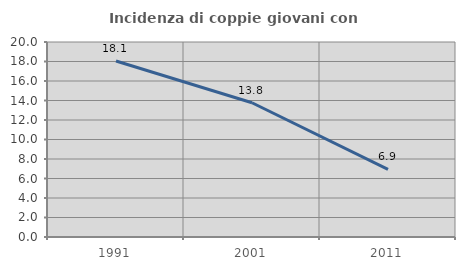
| Category | Incidenza di coppie giovani con figli |
|---|---|
| 1991.0 | 18.056 |
| 2001.0 | 13.77 |
| 2011.0 | 6.934 |